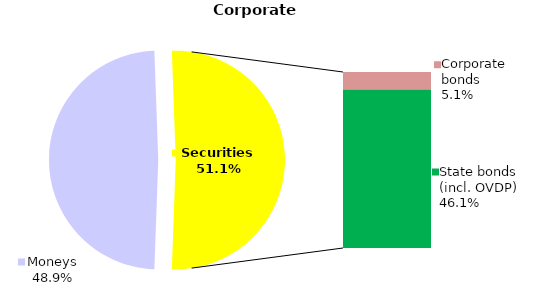
| Category | Corporate |
|---|---|
| Moneys | 137.492 |
| Bank metals | 0 |
| Real estate | 0 |
| Other assets | 0 |
| Equities | 0.022 |
| Corporate bonds | 14.226 |
| Municipal bonds | 0 |
| State bonds (incl. OVDP) | 129.65 |